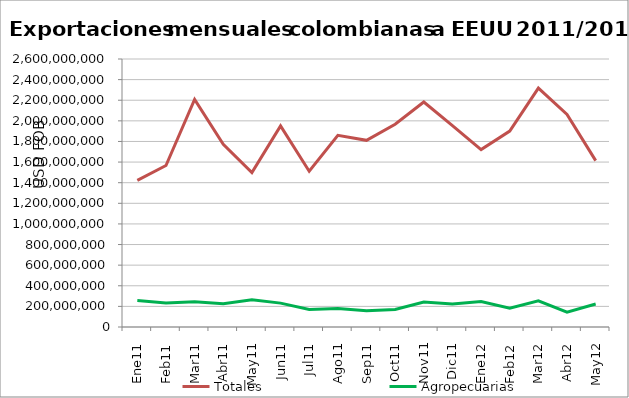
| Category | Totales | Agropecuarias |
|---|---|---|
| 0 | 1422869192.52 | 256180470.17 |
| 1 | 1566744360.17 | 233189681.18 |
| 2 | 2207767535.79 | 244321606.58 |
| 3 | 1773118545.67 | 225477927.43 |
| 4 | 1498229855.71 | 264187784.63 |
| 5 | 1950773026.17 | 231663062.61 |
| 6 | 1511522523.59 | 169591096.89 |
| 7 | 1859923312.34 | 178631875.67 |
| 8 | 1811093819.32 | 158081550.71 |
| 9 | 1967245618.76 | 170621883.67 |
| 10 | 2182797771.81 | 241809614.6 |
| 11 | 1953129121.89 | 223828787.67 |
| 12 | 1721406747.83 | 247361557.1 |
| 13 | 1900796801.76 | 181291200.56 |
| 14 | 2318081643.6 | 253642509.44 |
| 15 | 2062814784.57 | 144426072.74 |
| 16 | 1613706204.53 | 222871440.51 |